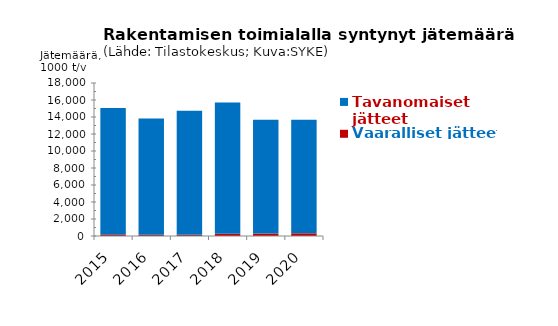
| Category | Vaaralliset jätteet | Tavanomaiset jätteet |
|---|---|---|
| 2015 | 185.849 | 14874.502 |
| 2016 | 146.149 | 13679.019 |
| 2017 | 138.505 | 14588.128 |
| 2018 | 252.715 | 15462.516 |
| 2019 | 286.967 | 13380.442 |
| 2020 | 314 | 13375 |